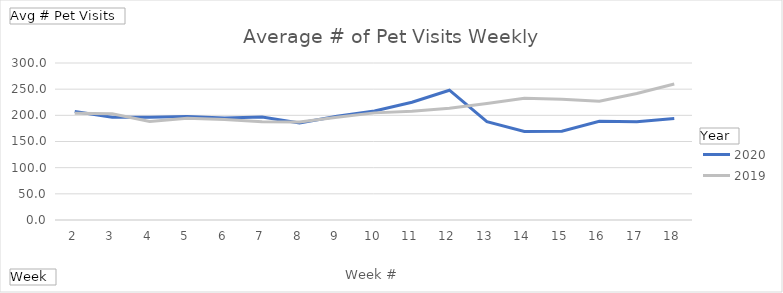
| Category | 2020 | 2019 |
|---|---|---|
| 2 | 207.305 | 204.162 |
| 3 | 196.257 | 202.943 |
| 4 | 196.562 | 188.448 |
| 5 | 197.971 | 194.229 |
| 6 | 194.981 | 192.267 |
| 7 | 196.905 | 187.648 |
| 8 | 185.457 | 187.057 |
| 9 | 198.381 | 196.362 |
| 10 | 208.238 | 204.695 |
| 11 | 225.067 | 207.657 |
| 12 | 248.01 | 213.638 |
| 13 | 187.81 | 222.429 |
| 14 | 169.162 | 232.686 |
| 15 | 169.625 | 230.81 |
| 16 | 188.686 | 226.933 |
| 17 | 187.951 | 241.781 |
| 18 | 193.91 | 259.743 |